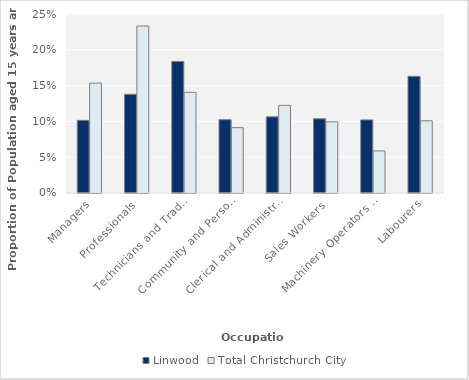
| Category | Linwood | Total Christchurch City |
|---|---|---|
| Managers | 0.102 | 0.153 |
| Professionals | 0.138 | 0.233 |
| Technicians and Trades Workers | 0.184 | 0.141 |
| Community and Personal Service Workers | 0.102 | 0.091 |
| Clerical and Administrative Workers | 0.106 | 0.122 |
| Sales Workers | 0.104 | 0.099 |
| Machinery Operators and Drivers | 0.102 | 0.059 |
| Labourers | 0.163 | 0.101 |